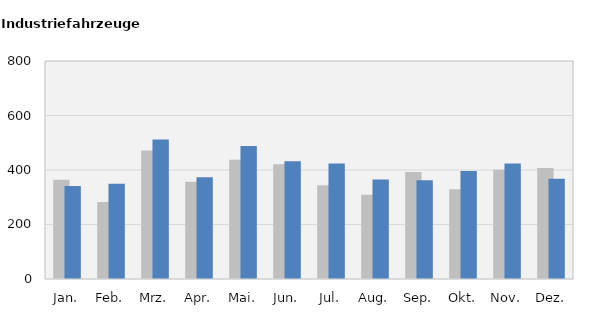
| Category | 2022 | 2023 |
|---|---|---|
| Jan. | 364 | 341 |
| Feb. | 283 | 350 |
| Mrz. | 472 | 512 |
| Apr. | 357 | 373 |
| Mai. | 438 | 488 |
| Jun. | 421 | 432 |
| Jul. | 344 | 424 |
| Aug. | 309 | 365 |
| Sep. | 393 | 362 |
| Okt. | 329 | 396 |
| Nov. | 401 | 424 |
| Dez. | 407 | 368 |